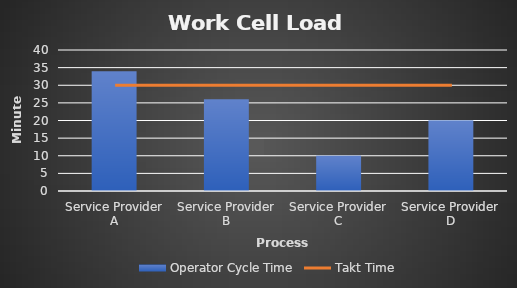
| Category | Operator Cycle Time |
|---|---|
| Service Provider A | 34 |
| Service Provider B | 26 |
| Service Provider C | 10 |
| Service Provider D | 20 |